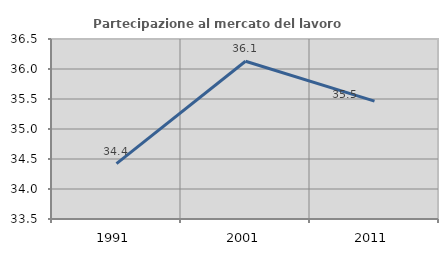
| Category | Partecipazione al mercato del lavoro  femminile |
|---|---|
| 1991.0 | 34.422 |
| 2001.0 | 36.13 |
| 2011.0 | 35.465 |